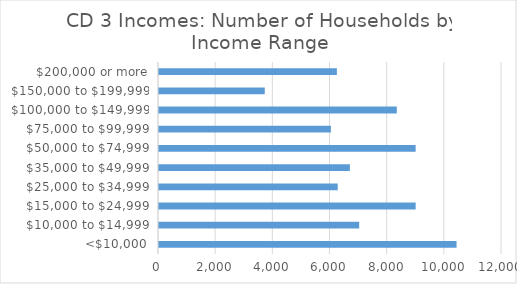
| Category | Series 0 |
|---|---|
| <$10,000 | 10410 |
| $10,000 to $14,999 | 7003 |
| $15,000 to $24,999 | 8980 |
| $25,000 to $34,999 | 6253 |
| $35,000 to $49,999 | 6678 |
| $50,000 to $74,999 | 8979 |
| $75,000 to $99,999 | 6013 |
| $100,000 to $149,999 | 8320 |
| $150,000 to $199,999 | 3700 |
| $200,000 or more | 6223 |